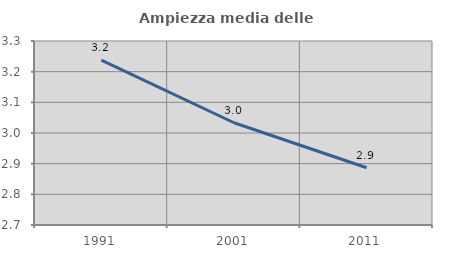
| Category | Ampiezza media delle famiglie |
|---|---|
| 1991.0 | 3.238 |
| 2001.0 | 3.033 |
| 2011.0 | 2.887 |